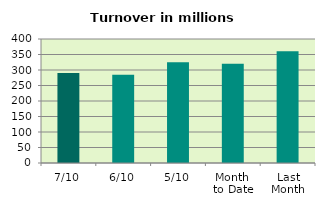
| Category | Series 0 |
|---|---|
| 7/10 | 290.671 |
| 6/10 | 284.956 |
| 5/10 | 325.105 |
| Month 
to Date | 320.185 |
| Last
Month | 360.198 |